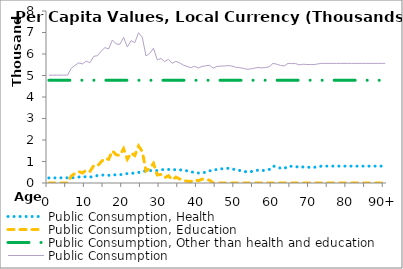
| Category | Public Consumption, Health | Public Consumption, Education | Public Consumption, Other than health and education | Public Consumption |
|---|---|---|---|---|
| 0 | 236.793 | 0 | 4778.035 | 5014.828 |
|  | 237.412 | 0 | 4778.035 | 5015.447 |
| 2 | 238.031 | 0 | 4778.035 | 5016.066 |
| 3 | 238.65 | 0 | 4778.035 | 5016.685 |
| 4 | 242.856 | 0 | 4778.035 | 5020.891 |
| 5 | 239.982 | 0 | 4778.035 | 5018.016 |
| 6 | 243.524 | 319.941 | 4778.035 | 5341.5 |
| 7 | 249.874 | 446.387 | 4778.035 | 5474.295 |
| 8 | 278.297 | 528.722 | 4778.035 | 5585.054 |
| 9 | 295.229 | 465.381 | 4778.035 | 5538.645 |
| 10 | 284.958 | 604.13 | 4778.035 | 5667.123 |
| 11 | 275.497 | 541.427 | 4778.035 | 5594.958 |
| 12 | 306.304 | 807.083 | 4778.035 | 5891.422 |
| 13 | 348.495 | 795.254 | 4778.035 | 5921.784 |
| 14 | 372.716 | 982.32 | 4778.035 | 6133.071 |
| 15 | 365.804 | 1153.129 | 4778.035 | 6296.967 |
| 16 | 356.026 | 1100.86 | 4778.035 | 6234.921 |
| 17 | 378.713 | 1493.654 | 4778.035 | 6650.402 |
| 18 | 377.993 | 1314.48 | 4778.035 | 6470.507 |
| 19 | 387.804 | 1281.308 | 4778.035 | 6447.147 |
| 20 | 399.13 | 1597.275 | 4778.035 | 6774.44 |
| 21 | 440.463 | 1104.336 | 4778.035 | 6322.834 |
| 22 | 443.492 | 1398.302 | 4778.035 | 6619.829 |
| 23 | 469.87 | 1277.032 | 4778.035 | 6524.936 |
| 24 | 491.44 | 1720.37 | 4778.035 | 6989.845 |
| 25 | 533.117 | 1469.431 | 4778.035 | 6780.583 |
| 26 | 572.268 | 557.863 | 4778.035 | 5908.166 |
| 27 | 578.947 | 672.076 | 4778.035 | 6029.057 |
| 28 | 576.919 | 914.976 | 4778.035 | 6269.929 |
| 29 | 577.495 | 375.372 | 4778.035 | 5730.901 |
| 30 | 617.156 | 395.064 | 4778.035 | 5790.255 |
| 31 | 626.561 | 242.597 | 4778.035 | 5647.193 |
| 32 | 628.88 | 343.301 | 4778.035 | 5750.215 |
| 33 | 640.374 | 147.947 | 4778.035 | 5566.356 |
| 34 | 608.239 | 271.677 | 4778.035 | 5657.95 |
| 35 | 618.878 | 188.024 | 4778.035 | 5584.937 |
| 36 | 580.359 | 124.23 | 4778.035 | 5482.624 |
| 37 | 566.745 | 79.283 | 4778.035 | 5424.063 |
| 38 | 515.518 | 70.982 | 4778.035 | 5364.535 |
| 39 | 492.81 | 157.471 | 4778.035 | 5428.315 |
| 40 | 465.272 | 104.168 | 4778.035 | 5347.475 |
| 41 | 461.98 | 181.847 | 4778.035 | 5421.862 |
| 42 | 508.359 | 165.09 | 4778.035 | 5451.483 |
| 43 | 569.235 | 129.135 | 4778.035 | 5476.405 |
| 44 | 567.5 | 0 | 4778.035 | 5345.534 |
| 45 | 642.94 | 0 | 4778.035 | 5420.975 |
| 46 | 658.278 | 0 | 4778.035 | 5436.313 |
| 47 | 664.333 | 0 | 4778.035 | 5442.367 |
| 48 | 682.434 | 0 | 4778.035 | 5460.469 |
| 49 | 664.433 | 0 | 4778.035 | 5442.468 |
| 50 | 606.35 | 0 | 4778.035 | 5384.385 |
| 51 | 587.164 | 0 | 4778.035 | 5365.198 |
| 52 | 557.422 | 0 | 4778.035 | 5335.457 |
| 53 | 510.897 | 0 | 4778.035 | 5288.932 |
| 54 | 525.378 | 0 | 4778.035 | 5303.413 |
| 55 | 562.145 | 0 | 4778.035 | 5340.18 |
| 56 | 597.081 | 0 | 4778.035 | 5375.115 |
| 57 | 575.913 | 0 | 4778.035 | 5353.948 |
| 58 | 591.263 | 0 | 4778.035 | 5369.297 |
| 59 | 632.773 | 0 | 4778.035 | 5410.808 |
| 60 | 786.007 | 0 | 4778.035 | 5564.042 |
| 61 | 747.063 | 0 | 4778.035 | 5525.098 |
| 62 | 689.716 | 0 | 4778.035 | 5467.751 |
| 63 | 666.61 | 0 | 4778.035 | 5444.644 |
| 64 | 786.047 | 0 | 4778.035 | 5564.081 |
| 65 | 775.091 | 0 | 4778.035 | 5553.126 |
| 66 | 777.911 | 0 | 4778.035 | 5555.946 |
| 67 | 717.351 | 0 | 4778.035 | 5495.386 |
| 68 | 746.047 | 0 | 4778.035 | 5524.082 |
| 69 | 734.182 | 0 | 4778.035 | 5512.217 |
| 70 | 731.331 | 0 | 4778.035 | 5509.366 |
| 71 | 731.331 | 0 | 4778.035 | 5509.366 |
| 72 | 760.614 | 0 | 4778.035 | 5538.649 |
| 73 | 784.91 | 0 | 4778.035 | 5562.945 |
| 74 | 784.91 | 0 | 4778.035 | 5562.945 |
| 75 | 784.91 | 0 | 4778.035 | 5562.945 |
| 76 | 784.91 | 0 | 4778.035 | 5562.945 |
| 77 | 784.91 | 0 | 4778.035 | 5562.945 |
| 78 | 784.91 | 0 | 4778.035 | 5562.945 |
| 79 | 784.91 | 0 | 4778.035 | 5562.945 |
| 80 | 784.91 | 0 | 4778.035 | 5562.945 |
| 81 | 784.91 | 0 | 4778.035 | 5562.945 |
| 82 | 784.91 | 0 | 4778.035 | 5562.945 |
| 83 | 784.91 | 0 | 4778.035 | 5562.945 |
| 84 | 784.91 | 0 | 4778.035 | 5562.945 |
| 85 | 784.91 | 0 | 4778.035 | 5562.945 |
| 86 | 784.91 | 0 | 4778.035 | 5562.945 |
| 87 | 784.91 | 0 | 4778.035 | 5562.945 |
| 88 | 784.91 | 0 | 4778.035 | 5562.945 |
| 89 | 784.91 | 0 | 4778.035 | 5562.945 |
| 90+ | 784.91 | 0 | 4778.035 | 5562.945 |